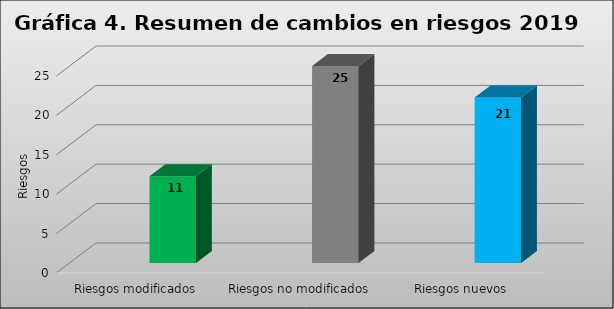
| Category | Series 0 | Series 1 |
|---|---|---|
| Riesgos modificados |  | 11 |
| Riesgos no modificados |  | 25 |
| Riesgos nuevos |  | 21 |